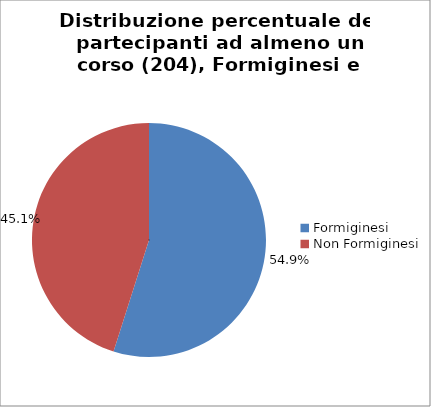
| Category | Nr. Tesserati |
|---|---|
| Formiginesi | 112 |
| Non Formiginesi | 92 |